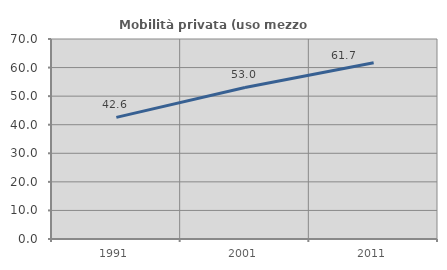
| Category | Mobilità privata (uso mezzo privato) |
|---|---|
| 1991.0 | 42.574 |
| 2001.0 | 53.039 |
| 2011.0 | 61.667 |